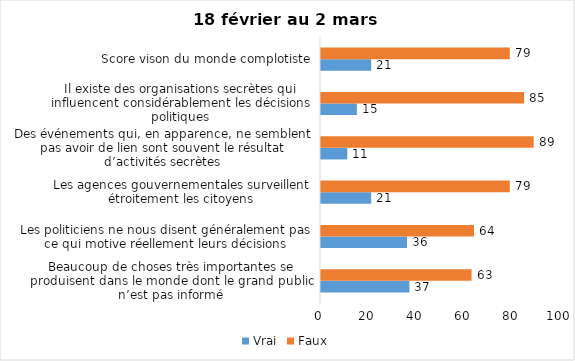
| Category | Vrai | Faux |
|---|---|---|
| Beaucoup de choses très importantes se produisent dans le monde dont le grand public n’est pas informé | 37 | 63 |
| Les politiciens ne nous disent généralement pas ce qui motive réellement leurs décisions | 36 | 64 |
| Les agences gouvernementales surveillent étroitement les citoyens | 21 | 79 |
| Des événements qui, en apparence, ne semblent pas avoir de lien sont souvent le résultat d’activités secrètes | 11 | 89 |
| Il existe des organisations secrètes qui influencent considérablement les décisions politiques | 15 | 85 |
| Score vison du monde complotiste | 21 | 79 |